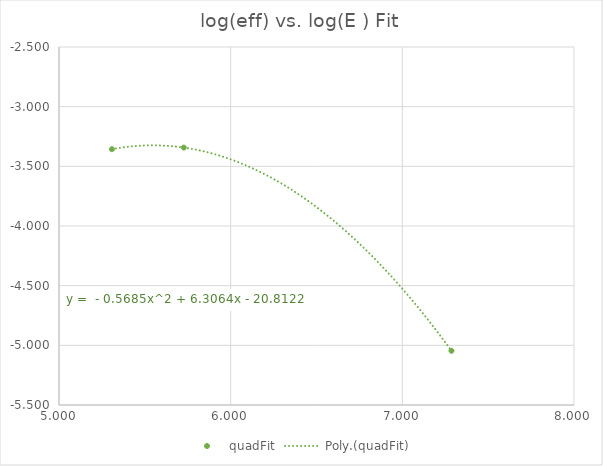
| Category | quadFit |
|---|---|
| 5.308267697401205 | -3.356 |
| 5.726847747587197 | -3.343 |
| 7.286191714702382 | -5.046 |